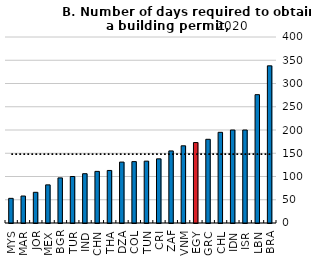
| Category | B: Dealing with construction permits: number of days required to obtain a building permit |
|---|---|
| MYS | 53 |
| MAR | 58 |
| JOR | 66 |
| MEX | 82 |
| BGR | 97 |
| TUR | 100 |
| IND | 106 |
| CHN | 111 |
| THA | 113 |
| DZA | 131 |
| COL | 132 |
| TUN | 133 |
| CRI | 138 |
| ZAF | 155 |
| VNM | 166 |
| EGY | 173 |
| GRC | 180 |
| CHL | 195 |
| IDN | 200 |
| ISR | 200 |
| LBN | 276 |
| BRA | 338 |